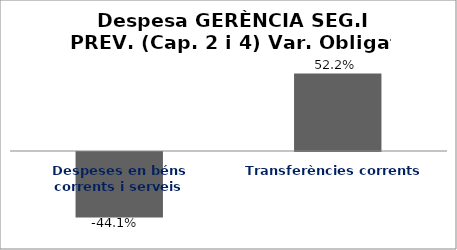
| Category | Series 0 |
|---|---|
| Despeses en béns corrents i serveis | -0.441 |
| Transferències corrents | 0.522 |